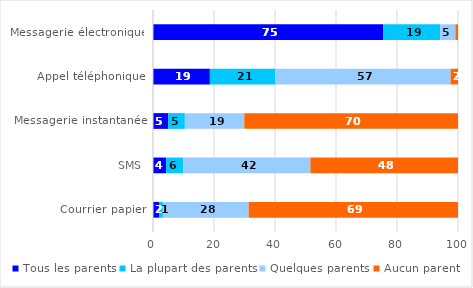
| Category | Tous les parents | La plupart des parents | Quelques parents | Aucun parent |
|---|---|---|---|---|
| Messagerie électronique | 75.465 | 18.738 | 4.961 | 0.836 |
| Appel téléphonique | 18.644 | 21.495 | 57.447 | 2.414 |
| Messagerie instantanée | 5.021 | 5.422 | 19.481 | 70.076 |
| SMS | 4.309 | 5.636 | 41.669 | 48.386 |
| Courrier papier | 2.12 | 1.114 | 28.147 | 68.619 |